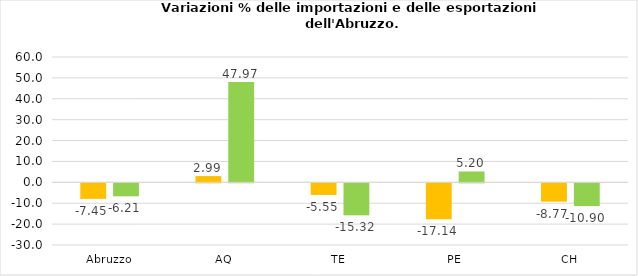
| Category | Totale importazioni | Totale esportazionio |
|---|---|---|
| Abruzzo | -7.447 | -6.215 |
| AQ | 2.988 | 47.973 |
| TE | -5.553 | -15.323 |
| PE | -17.144 | 5.203 |
| CH | -8.768 | -10.904 |